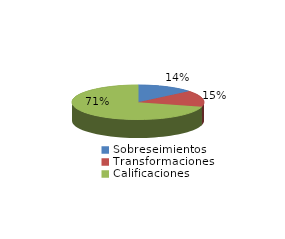
| Category | Series 0 |
|---|---|
| Sobreseimientos | 3473 |
| Transformaciones | 3809 |
| Calificaciones | 17649 |